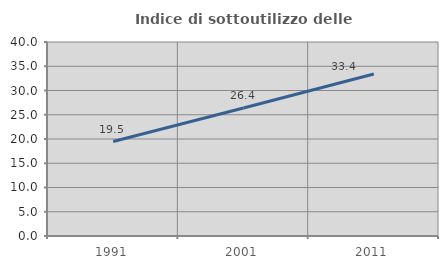
| Category | Indice di sottoutilizzo delle abitazioni  |
|---|---|
| 1991.0 | 19.479 |
| 2001.0 | 26.377 |
| 2011.0 | 33.415 |